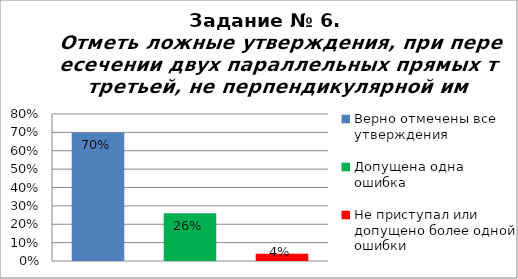
| Category | Отметь ложные утверждения, при пересечении двух параллельных прямых третьей, не перпендикулярной им. |
|---|---|
| Верно отмечены все утверждения | 0.7 |
| Допущена одна ошибка | 0.26 |
| Не приступал или допущено более одной ошибки | 0.04 |